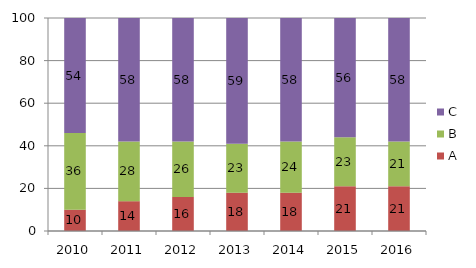
| Category | A | B | C |
|---|---|---|---|
| 2010.0 | 10 | 36 | 54 |
| 2011.0 | 14 | 28 | 58 |
| 2012.0 | 16 | 26 | 58 |
| 2013.0 | 18 | 23 | 59 |
| 2014.0 | 18 | 24 | 58 |
| 2015.0 | 21 | 23 | 56 |
| 2016.0 | 21 | 21 | 58 |